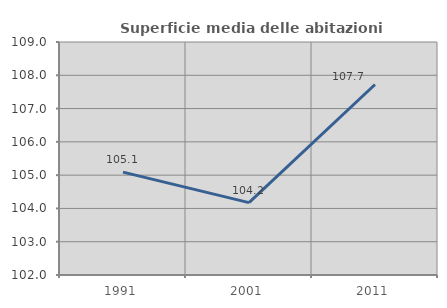
| Category | Superficie media delle abitazioni occupate |
|---|---|
| 1991.0 | 105.091 |
| 2001.0 | 104.173 |
| 2011.0 | 107.723 |